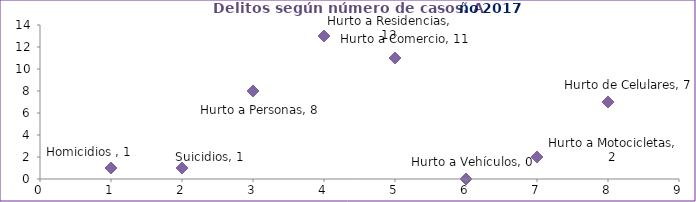
| Category | Series 0 |
|---|---|
| 0 | 1 |
| 1 | 1 |
| 2 | 8 |
| 3 | 13 |
| 4 | 11 |
| 5 | 0 |
| 6 | 2 |
| 7 | 7 |